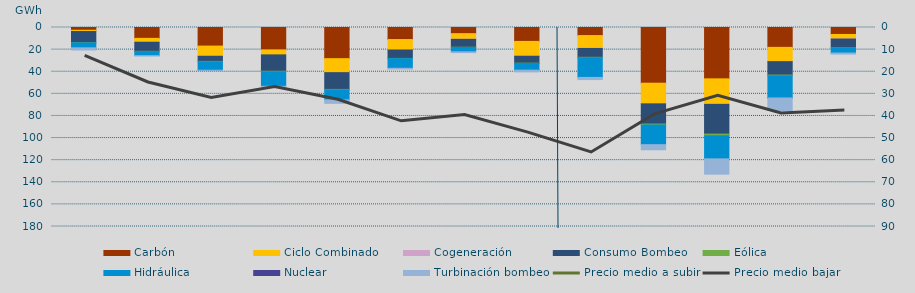
| Category | Carbón | Ciclo Combinado | Cogeneración | Consumo Bombeo | Eólica | Hidráulica | Nuclear | Turbinación bombeo |
|---|---|---|---|---|---|---|---|---|
| 0 | 2502.1 | 1126 | 0 | 10105.8 | 176.9 | 4467.7 | 0 | 1975.3 |
| 1 | 9826.3 | 3497.3 | 0 | 8231.5 | 242 | 3677.4 | 0 | 129.8 |
| 2 | 16804.9 | 9200.1 | 0 | 4654.1 | 369.5 | 7625.8 | 0 | 107.2 |
| 3 | 20254.1 | 4502.5 | 0 | 14825.7 | 422.9 | 13215.2 | 0 | 462.9 |
| 4 | 28176.4 | 12664.3 | 0 | 15166.3 | 462.1 | 8996.5 | 0 | 3124.7 |
| 5 | 10892.6 | 9459.3 | 19 | 7585 | 201.8 | 8745.3 | 0 | 691.6 |
| 6 | 5563.5 | 5060.2 | 113 | 7129.2 | 169.4 | 3964.2 | 0 | 709 |
| 7 | 12581.1 | 13203.9 | 233 | 6261.8 | 220.5 | 5846.4 | 125 | 1688.7 |
| 8 | 7306.9 | 11559.1 | 88 | 7999 | 402.8 | 17797.7 | 0 | 1941.3 |
| 9 | 50376 | 18600.8 | 92.8 | 18257.2 | 867.9 | 17793.5 | 0 | 4596.7 |
| 10 | 46429 | 22875.8 | 230 | 26858.5 | 1566 | 20878.9 | 0 | 13810.2 |
| 11 | 17956.2 | 12815.5 | 103.4 | 12162.2 | 688.3 | 19850.2 | 66 | 11430.1 |
| 12 | 6283.8 | 4145.3 | 18.9 | 7977.8 | 313 | 4389.8 | 0 | 935.6 |